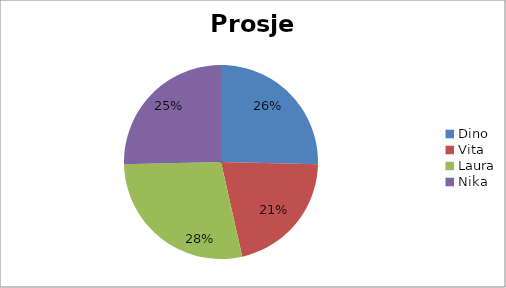
| Category | Prosjek |
|---|---|
| Dino | 4.5 |
| Vita | 3.75 |
| Laura | 5 |
| Nika | 4.5 |